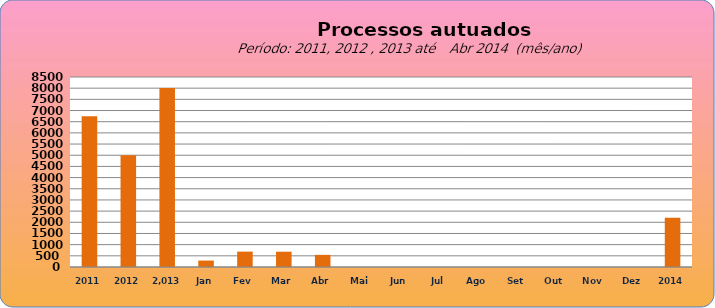
| Category | 6749 4998  8.003   288  688 684 543 0 0 0 0 0 0 0 0 |
|---|---|
| 2011 | 6749 |
| 2012 | 4998 |
|  2.013  | 8003 |
| Jan | 288 |
| Fev | 688 |
| Mar | 684 |
| Abr | 543 |
| Mai | 0 |
| Jun | 0 |
| Jul | 0 |
| Ago | 0 |
| Set | 0 |
| Out | 0 |
| Nov | 0 |
| Dez | 0 |
| 2014 | 2203 |